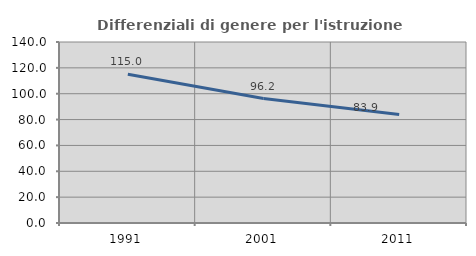
| Category | Differenziali di genere per l'istruzione superiore |
|---|---|
| 1991.0 | 115.009 |
| 2001.0 | 96.225 |
| 2011.0 | 83.886 |